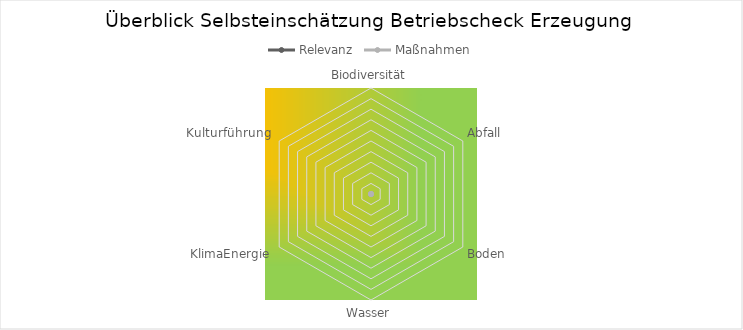
| Category | Relevanz | Maßnahmen |
|---|---|---|
| Biodiversität | 0 | 0 |
| Abfall | 0 | 0 |
| Boden | 0 | 0 |
| Wasser | 0 | 0 |
| KlimaEnergie | 0 | 0 |
| Kulturführung | 0 | 0 |